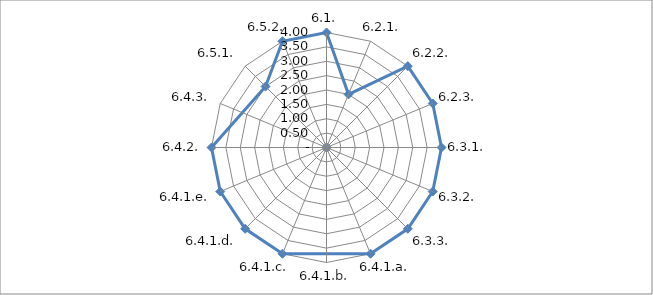
| Category | Series 0 |
|---|---|
| 6.1. | 4 |
| 6.2.1. | 2 |
| 6.2.2. | 4 |
| 6.2.3. | 4 |
| 6.3.1. | 4 |
| 6.3.2. | 4 |
| 6.3.3. | 4 |
| 6.4.1.a. | 4 |
| 6.4.1.b. | 0 |
| 6.4.1.c. | 4 |
| 6.4.1.d. | 4 |
| 6.4.1.e. | 4 |
| 6.4.2. | 4 |
| 6.4.3. | 0 |
| 6.5.1. | 3 |
| 6.5.2. | 4 |